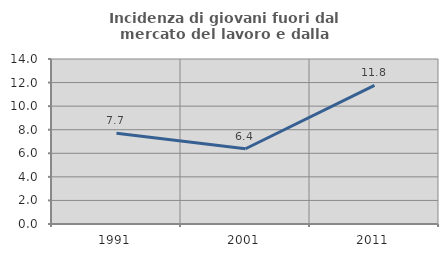
| Category | Incidenza di giovani fuori dal mercato del lavoro e dalla formazione  |
|---|---|
| 1991.0 | 7.692 |
| 2001.0 | 6.383 |
| 2011.0 | 11.765 |